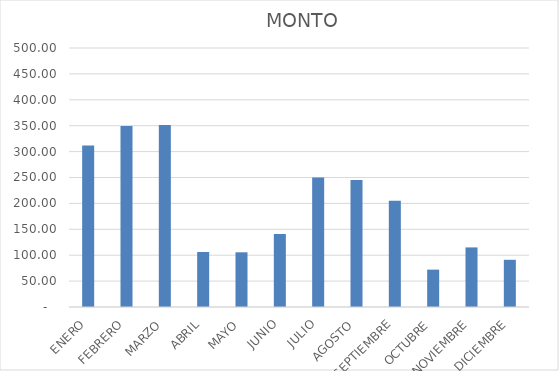
| Category | Series 0 |
|---|---|
| ENERO | 311.89 |
| FEBRERO | 349.22 |
| MARZO | 351.44 |
| ABRIL | 106.23 |
| MAYO | 105.59 |
| JUNIO | 140.96 |
| JULIO | 250 |
| AGOSTO | 245.18 |
| SEPTIEMBRE | 205.15 |
| OCTUBRE | 72.12 |
| NOVIEMBRE | 115.04 |
| DICIEMBRE | 91.13 |